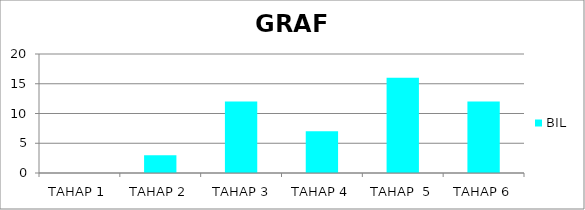
| Category | BIL |
|---|---|
| TAHAP 1 | 0 |
| TAHAP 2 | 3 |
|  TAHAP 3 | 12 |
| TAHAP 4 | 7 |
| TAHAP  5 | 16 |
| TAHAP 6 | 12 |